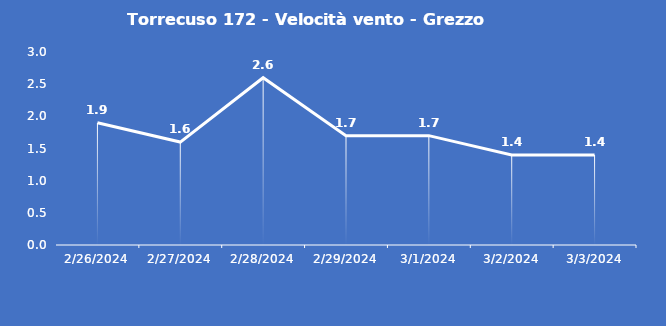
| Category | Torrecuso 172 - Velocità vento - Grezzo (m/s) |
|---|---|
| 2/26/24 | 1.9 |
| 2/27/24 | 1.6 |
| 2/28/24 | 2.6 |
| 2/29/24 | 1.7 |
| 3/1/24 | 1.7 |
| 3/2/24 | 1.4 |
| 3/3/24 | 1.4 |